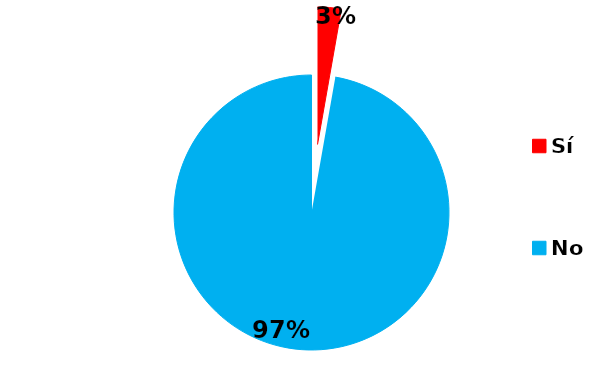
| Category | Series 0 |
|---|---|
| Sí | 1 |
| No | 35 |